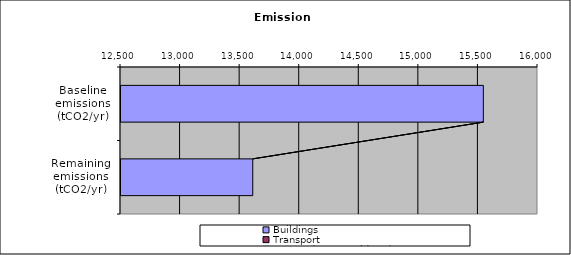
| Category | Buildings | Transport |  Demand not considered   |
|---|---|---|---|
| Baseline emissions (tCO2/yr) | 15549.687 | 0 | 0 |
| Remaining emissions (tCO2/yr) | 13614.251 | 0 | 0 |